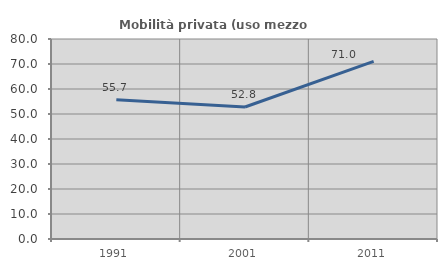
| Category | Mobilità privata (uso mezzo privato) |
|---|---|
| 1991.0 | 55.738 |
| 2001.0 | 52.8 |
| 2011.0 | 71.028 |